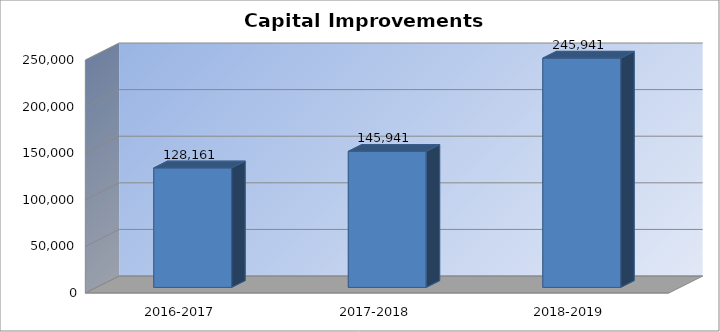
| Category | Capital Improvements |
|---|---|
| 2016-2017 | 128161 |
| 2017-2018 | 145941 |
| 2018-2019 | 245941 |